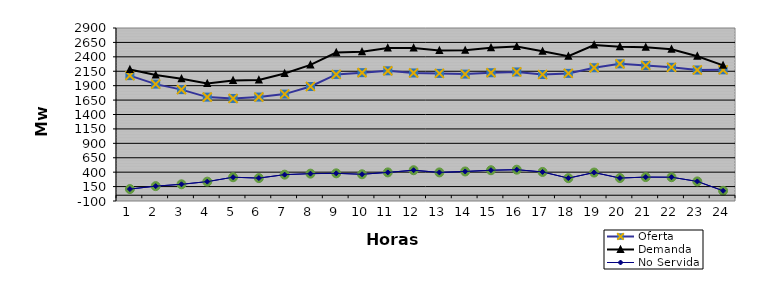
| Category | Oferta | No Servida | Demanda |
|---|---|---|---|
| 1.0 | 2074.43 | 106.94 | 2181.37 |
| 2.0 | 1927 | 157.83 | 2084.83 |
| 3.0 | 1831.66 | 189.79 | 2021.45 |
| 4.0 | 1701.48 | 235.85 | 1937.33 |
| 5.0 | 1678.07 | 312.24 | 1990.31 |
| 6.0 | 1702.5 | 297.24 | 1999.74 |
| 7.0 | 1753.48 | 356.84 | 2110.32 |
| 8.0 | 1885.36 | 374.44 | 2259.8 |
| 9.0 | 2095.29 | 380.02 | 2475.31 |
| 10.0 | 2125.62 | 363.49 | 2489.11 |
| 11.0 | 2157.45 | 396.06 | 2553.51 |
| 12.0 | 2120.15 | 433.7 | 2553.85 |
| 13.0 | 2112.76 | 395.83 | 2508.59 |
| 14.0 | 2100.21 | 412.24 | 2512.45 |
| 15.0 | 2124.33 | 433.55 | 2557.88 |
| 16.0 | 2137.56 | 442.92 | 2580.48 |
| 17.0 | 2093.25 | 403.72 | 2496.97 |
| 18.0 | 2113.03 | 296.45 | 2409.48 |
| 19.0 | 2210.98 | 393.55 | 2604.53 |
| 20.0 | 2278.68 | 297.99 | 2576.67 |
| 21.0 | 2250.44 | 314.77 | 2565.21 |
| 22.0 | 2218.38 | 312.5 | 2530.88 |
| 23.0 | 2171.5 | 239.76 | 2411.26 |
| 24.0 | 2174.79 | 77.25 | 2252.04 |